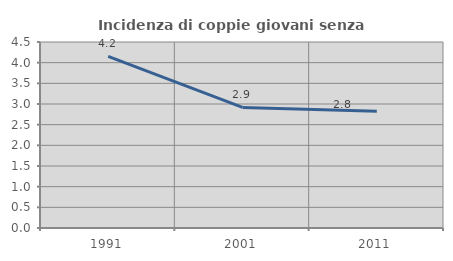
| Category | Incidenza di coppie giovani senza figli |
|---|---|
| 1991.0 | 4.151 |
| 2001.0 | 2.918 |
| 2011.0 | 2.827 |